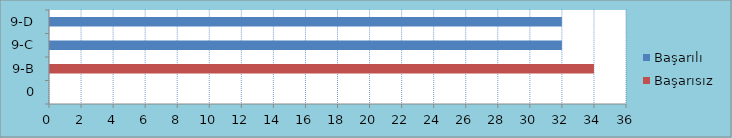
| Category | Başarılı | Başarısız |
|---|---|---|
| 0 | 0 | 0 |
| 9-B | 0 | 34 |
| 9-C | 32 | 0 |
| 9-D | 32 | 0 |